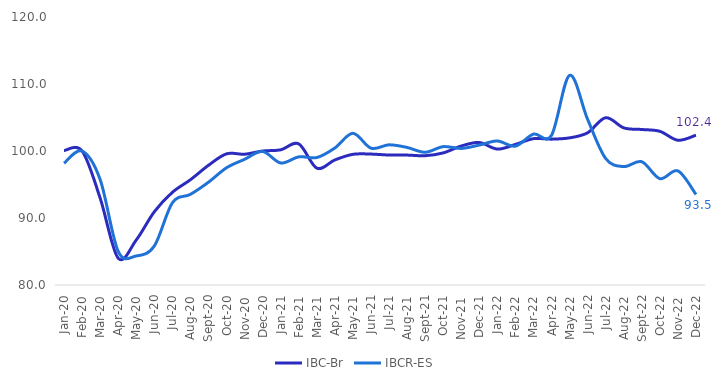
| Category | IBC-Br | IBCR-ES |
|---|---|---|
| 2020-01-01 | 100.072 | 98.174 |
| 2020-02-01 | 100 | 100 |
| 2020-03-01 | 92.979 | 95.741 |
| 2020-04-01 | 84.003 | 85.02 |
| 2020-05-01 | 86.718 | 84.337 |
| 2020-06-01 | 90.931 | 85.822 |
| 2020-07-01 | 93.832 | 92.263 |
| 2020-08-01 | 95.709 | 93.531 |
| 2020-09-01 | 97.865 | 95.344 |
| 2020-10-01 | 99.577 | 97.498 |
| 2020-11-01 | 99.52 | 98.759 |
| 2020-12-01 | 100 | 99.93 |
| 2021-01-01 | 100.172 | 98.209 |
| 2021-02-01 | 101.06 | 99.129 |
| 2021-03-01 | 97.443 | 99.024 |
| 2021-04-01 | 98.668 | 100.446 |
| 2021-05-01 | 99.506 | 102.642 |
| 2021-06-01 | 99.542 | 100.425 |
| 2021-07-01 | 99.398 | 100.92 |
| 2021-08-01 | 99.391 | 100.53 |
| 2021-09-01 | 99.298 | 99.812 |
| 2021-10-01 | 99.713 | 100.648 |
| 2021-11-01 | 100.745 | 100.383 |
| 2021-12-01 | 101.268 | 100.885 |
| 2022-01-01 | 100.287 | 101.492 |
| 2022-02-01 | 100.981 | 100.725 |
| 2022-03-01 | 101.841 | 102.523 |
| 2022-04-01 | 101.769 | 102.349 |
| 2022-05-01 | 101.963 | 111.292 |
| 2022-06-01 | 102.722 | 104.712 |
| 2022-07-01 | 104.972 | 98.878 |
| 2022-08-01 | 103.453 | 97.672 |
| 2022-09-01 | 103.209 | 98.397 |
| 2022-10-01 | 102.937 | 95.873 |
| 2022-11-01 | 101.605 | 97.031 |
| 2022-12-01 | 102.357 | 93.517 |